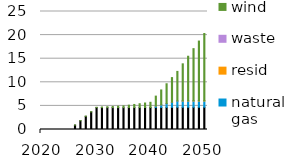
| Category | biomass | coal | natural gas | resid | waste | wind |
|---|---|---|---|---|---|---|
| 2020.0 | 0 | 0 | 0 | 0 | 0 | 0 |
| 2021.0 | 0 | 0 | 0 | 0 | 0 | 0 |
| 2022.0 | 0 | 0 | 0 | 0 | 0 | 0 |
| 2023.0 | 0 | 0 | 0 | 0 | 0 | 0 |
| 2024.0 | 0 | 0 | 0 | 0 | 0 | 0 |
| 2025.0 | 0 | 0 | 0 | 0 | 0 | 0 |
| 2026.0 | 0 | 0.93 | 0 | 0 | 0 | 0.012 |
| 2027.0 | 0 | 1.86 | 0 | 0 | 0 | 0.024 |
| 2028.0 | 0 | 2.79 | 0 | 0 | 0 | 0.036 |
| 2029.0 | 0 | 3.721 | 0 | 0 | 0 | 0.048 |
| 2030.0 | 0 | 4.651 | 0 | 0 | 0 | 0.06 |
| 2031.0 | 0 | 4.651 | 0 | 0 | 0.001 | 0.118 |
| 2032.0 | 0 | 4.651 | 0 | 0 | 0.001 | 0.176 |
| 2033.0 | 0 | 4.651 | 0 | 0 | 0.002 | 0.234 |
| 2034.0 | 0 | 4.651 | 0 | 0 | 0.002 | 0.292 |
| 2035.0 | 0 | 4.651 | 0 | 0 | 0.003 | 0.35 |
| 2036.0 | 0.003 | 4.651 | 0 | 0 | 0.002 | 0.5 |
| 2037.0 | 0.005 | 4.651 | 0 | 0 | 0.002 | 0.65 |
| 2038.0 | 0.008 | 4.651 | 0 | 0 | 0.001 | 0.8 |
| 2039.0 | 0.01 | 4.651 | 0 | 0 | 0.001 | 0.95 |
| 2040.0 | 0.013 | 4.651 | 0 | 0 | 0 | 1.1 |
| 2041.0 | 0.025 | 4.651 | 0.261 | 0 | 0 | 2.135 |
| 2042.0 | 0.037 | 4.651 | 0.523 | 0 | 0.001 | 3.17 |
| 2043.0 | 0.049 | 4.651 | 0.784 | 0 | 0.001 | 4.204 |
| 2044.0 | 0.061 | 4.651 | 1.045 | 0 | 0.002 | 5.239 |
| 2045.0 | 0.073 | 4.651 | 1.307 | 0 | 0.002 | 6.274 |
| 2046.0 | 0.073 | 4.651 | 1.307 | 0.024 | 0.002 | 7.858 |
| 2047.0 | 0.073 | 4.651 | 1.307 | 0.048 | 0.001 | 9.443 |
| 2048.0 | 0.073 | 4.651 | 1.307 | 0.071 | 0.001 | 11.027 |
| 2049.0 | 0.073 | 4.651 | 1.307 | 0.095 | 0 | 12.612 |
| 2050.0 | 0.073 | 4.651 | 1.307 | 0.119 | 0 | 14.196 |